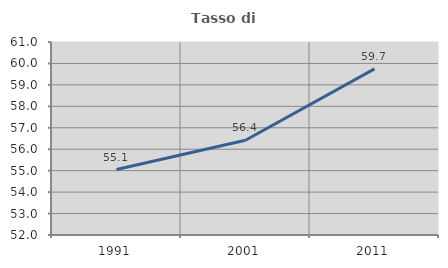
| Category | Tasso di occupazione   |
|---|---|
| 1991.0 | 55.052 |
| 2001.0 | 56.418 |
| 2011.0 | 59.748 |